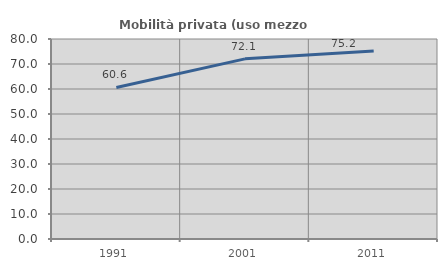
| Category | Mobilità privata (uso mezzo privato) |
|---|---|
| 1991.0 | 60.633 |
| 2001.0 | 72.059 |
| 2011.0 | 75.245 |